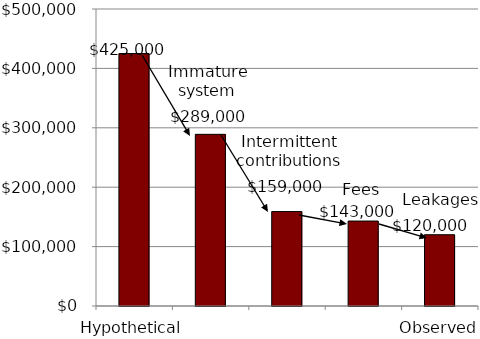
| Category | Series 0 |
|---|---|
| Hypothetical | 425000 |
|  | 289000 |
|  | 159000 |
|  | 143000 |
| Observed | 120000 |